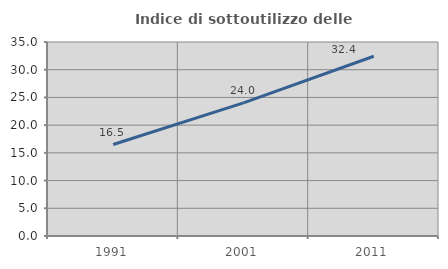
| Category | Indice di sottoutilizzo delle abitazioni  |
|---|---|
| 1991.0 | 16.506 |
| 2001.0 | 24.011 |
| 2011.0 | 32.427 |